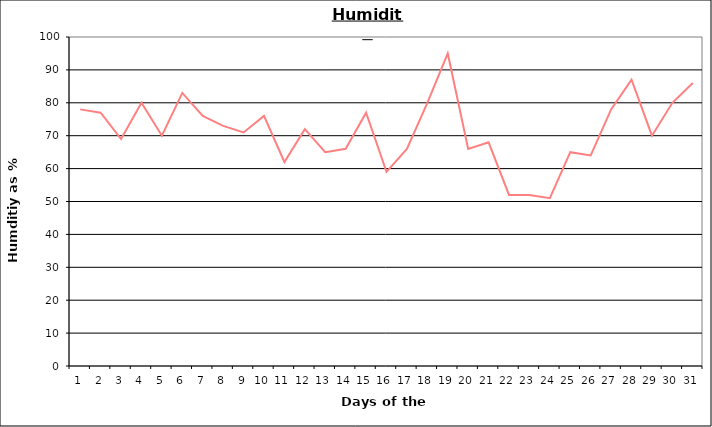
| Category | Series 0 |
|---|---|
| 0 | 78 |
| 1 | 77 |
| 2 | 69 |
| 3 | 80 |
| 4 | 70 |
| 5 | 83 |
| 6 | 76 |
| 7 | 73 |
| 8 | 71 |
| 9 | 76 |
| 10 | 62 |
| 11 | 72 |
| 12 | 65 |
| 13 | 66 |
| 14 | 77 |
| 15 | 59 |
| 16 | 66 |
| 17 | 80 |
| 18 | 95 |
| 19 | 66 |
| 20 | 68 |
| 21 | 52 |
| 22 | 52 |
| 23 | 51 |
| 24 | 65 |
| 25 | 64 |
| 26 | 78 |
| 27 | 87 |
| 28 | 70 |
| 29 | 80 |
| 30 | 86 |